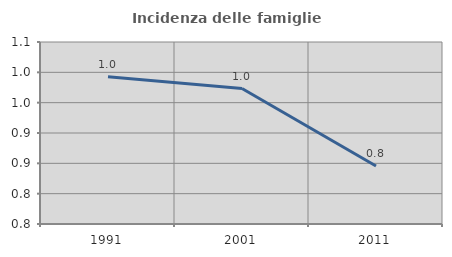
| Category | Incidenza delle famiglie numerose |
|---|---|
| 1991.0 | 0.993 |
| 2001.0 | 0.973 |
| 2011.0 | 0.846 |